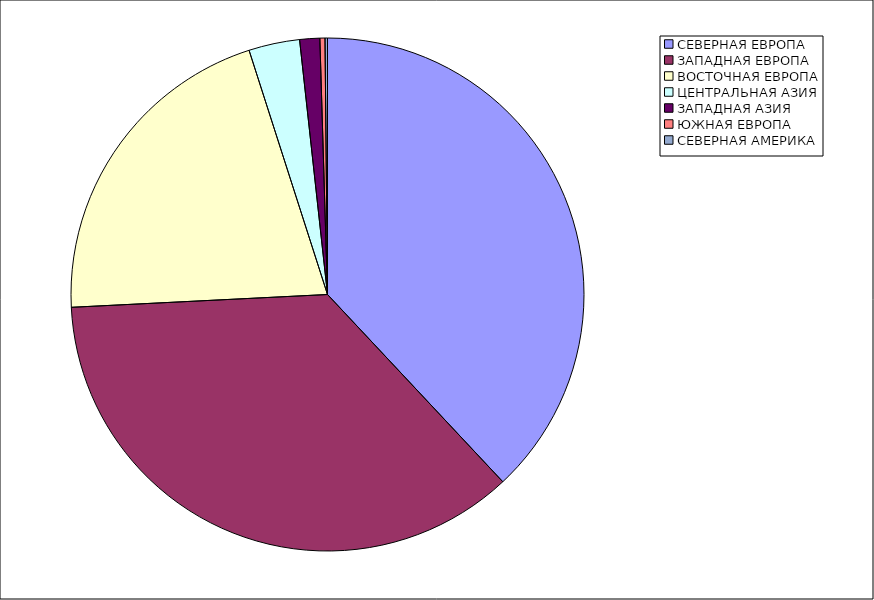
| Category | Оборот |
|---|---|
| СЕВЕРНАЯ ЕВРОПА | 38.023 |
| ЗАПАДНАЯ ЕВРОПА | 36.181 |
| ВОСТОЧНАЯ ЕВРОПА | 20.849 |
| ЦЕНТРАЛЬНАЯ АЗИЯ | 3.209 |
| ЗАПАДНАЯ АЗИЯ | 1.262 |
| ЮЖНАЯ ЕВРОПА | 0.321 |
| СЕВЕРНАЯ АМЕРИКА | 0.155 |